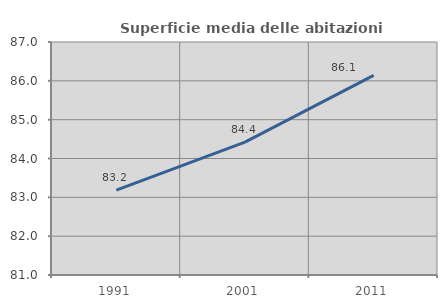
| Category | Superficie media delle abitazioni occupate |
|---|---|
| 1991.0 | 83.185 |
| 2001.0 | 84.424 |
| 2011.0 | 86.142 |